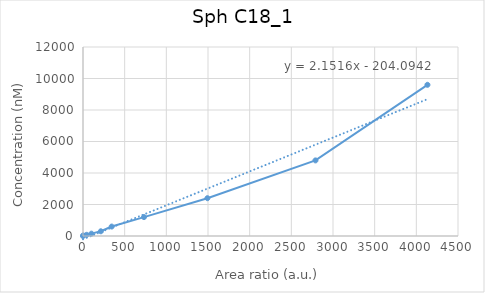
| Category | Sph C18_1 |
|---|---|
| 0.0 | 0 |
| 2.935933840847 | 37.5 |
| 44.3695249489422 | 75 |
| 101.082694412709 | 150 |
| 214.010094011698 | 300 |
| 344.507793840652 | 600 |
| 731.711111428447 | 1200 |
| 1492.91491328281 | 2400 |
| 2789.67823986851 | 4800 |
| 4133.4561837028 | 9600 |